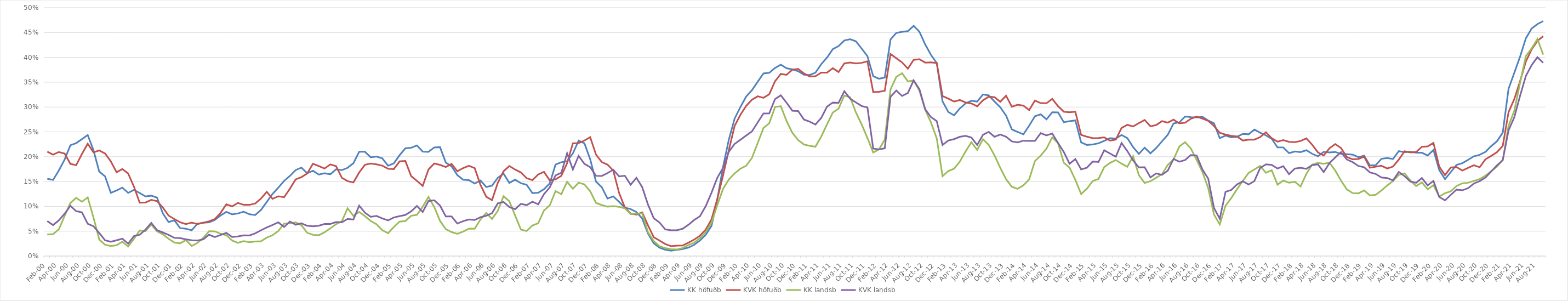
| Category | KK höfuðb | KVK höfuðb | KK landsb | KVK landsb |
|---|---|---|---|---|
| feb.00 | 0.156 | 0.21 | 0.043 | 0.07 |
| mar.00 | 0.153 | 0.204 | 0.044 | 0.062 |
| apr.00 | 0.172 | 0.209 | 0.054 | 0.072 |
| maí.00 | 0.194 | 0.206 | 0.081 | 0.085 |
| jún.00 | 0.223 | 0.186 | 0.107 | 0.101 |
| júl.00 | 0.227 | 0.183 | 0.117 | 0.09 |
| ágú.00 | 0.235 | 0.205 | 0.109 | 0.088 |
| sep.00 | 0.244 | 0.226 | 0.118 | 0.065 |
| okt.00 | 0.213 | 0.209 | 0.077 | 0.06 |
| nóv.00 | 0.17 | 0.213 | 0.033 | 0.046 |
| des.00 | 0.16 | 0.206 | 0.023 | 0.032 |
| jan.01 | 0.127 | 0.191 | 0.02 | 0.029 |
| feb.01 | 0.132 | 0.169 | 0.022 | 0.032 |
| mar.01 | 0.138 | 0.175 | 0.029 | 0.035 |
| apr.01 | 0.127 | 0.166 | 0.019 | 0.025 |
| maí.01 | 0.133 | 0.14 | 0.034 | 0.04 |
| jún.01 | 0.127 | 0.107 | 0.051 | 0.043 |
| júl.01 | 0.12 | 0.108 | 0.05 | 0.053 |
| ágú.01 | 0.122 | 0.113 | 0.063 | 0.067 |
| sep.01 | 0.118 | 0.111 | 0.05 | 0.052 |
| okt.01 | 0.086 | 0.098 | 0.044 | 0.047 |
| nóv.01 | 0.068 | 0.081 | 0.035 | 0.043 |
| des.01 | 0.072 | 0.074 | 0.027 | 0.037 |
| jan.02 | 0.056 | 0.068 | 0.026 | 0.036 |
| feb.02 | 0.055 | 0.064 | 0.032 | 0.034 |
| mar.02 | 0.052 | 0.067 | 0.02 | 0.032 |
| apr.02 | 0.065 | 0.064 | 0.026 | 0.031 |
| maí.02 | 0.067 | 0.067 | 0.037 | 0.034 |
| jún.02 | 0.068 | 0.07 | 0.05 | 0.043 |
| júl.02 | 0.073 | 0.074 | 0.05 | 0.038 |
| ágú.02 | 0.082 | 0.087 | 0.045 | 0.042 |
| sep.02 | 0.089 | 0.104 | 0.042 | 0.047 |
| okt.02 | 0.084 | 0.1 | 0.031 | 0.038 |
| nóv.02 | 0.086 | 0.107 | 0.027 | 0.039 |
| des.02 | 0.089 | 0.103 | 0.03 | 0.042 |
| jan.03 | 0.084 | 0.103 | 0.028 | 0.042 |
| feb.03 | 0.083 | 0.106 | 0.029 | 0.046 |
| mar.03 | 0.093 | 0.116 | 0.03 | 0.052 |
| apr.03 | 0.109 | 0.129 | 0.037 | 0.058 |
| maí.03 | 0.125 | 0.115 | 0.042 | 0.062 |
| jún.03 | 0.138 | 0.12 | 0.05 | 0.068 |
| júl.03 | 0.151 | 0.118 | 0.065 | 0.059 |
| ágú.03 | 0.161 | 0.135 | 0.066 | 0.069 |
| sep.03 | 0.173 | 0.154 | 0.068 | 0.063 |
| okt.03 | 0.178 | 0.159 | 0.062 | 0.066 |
| nóv.03 | 0.167 | 0.166 | 0.047 | 0.061 |
| des.03 | 0.172 | 0.186 | 0.043 | 0.06 |
| jan.04 | 0.164 | 0.181 | 0.042 | 0.061 |
| feb.04 | 0.167 | 0.176 | 0.048 | 0.064 |
| mar.04 | 0.165 | 0.185 | 0.056 | 0.065 |
| apr.04 | 0.175 | 0.181 | 0.064 | 0.068 |
| maí.04 | 0.173 | 0.158 | 0.07 | 0.068 |
| jún.04 | 0.178 | 0.151 | 0.096 | 0.075 |
| júl.04 | 0.187 | 0.148 | 0.081 | 0.074 |
| ágú.04 | 0.21 | 0.168 | 0.089 | 0.101 |
| sep.04 | 0.21 | 0.184 | 0.08 | 0.087 |
| okt.04 | 0.199 | 0.186 | 0.071 | 0.079 |
| nóv.04 | 0.2 | 0.185 | 0.064 | 0.081 |
| des.04 | 0.197 | 0.182 | 0.052 | 0.076 |
| jan.05 | 0.182 | 0.176 | 0.046 | 0.072 |
| feb.05 | 0.187 | 0.175 | 0.059 | 0.078 |
| mar.05 | 0.203 | 0.191 | 0.069 | 0.08 |
| apr.05 | 0.217 | 0.191 | 0.07 | 0.083 |
| maí.05 | 0.218 | 0.161 | 0.081 | 0.09 |
| jún.05 | 0.223 | 0.151 | 0.083 | 0.101 |
| júl.05 | 0.21 | 0.141 | 0.099 | 0.089 |
| ágú.05 | 0.21 | 0.174 | 0.119 | 0.111 |
| sep.05 | 0.219 | 0.186 | 0.099 | 0.112 |
| okt.05 | 0.219 | 0.184 | 0.071 | 0.102 |
| nóv.05 | 0.188 | 0.179 | 0.054 | 0.08 |
| des.05 | 0.181 | 0.185 | 0.048 | 0.08 |
| jan.06 | 0.163 | 0.171 | 0.045 | 0.065 |
| feb.06 | 0.154 | 0.177 | 0.049 | 0.07 |
| mar.06 | 0.153 | 0.182 | 0.055 | 0.074 |
| apr.06 | 0.146 | 0.177 | 0.055 | 0.072 |
| maí.06 | 0.152 | 0.143 | 0.074 | 0.078 |
| jún.06 | 0.139 | 0.119 | 0.087 | 0.081 |
| júl.06 | 0.142 | 0.113 | 0.075 | 0.086 |
| ágú.06 | 0.158 | 0.147 | 0.091 | 0.106 |
| sep.06 | 0.166 | 0.171 | 0.121 | 0.109 |
| okt.06 | 0.147 | 0.181 | 0.11 | 0.099 |
| nóv.06 | 0.154 | 0.174 | 0.082 | 0.094 |
| des.06 | 0.147 | 0.168 | 0.053 | 0.105 |
| jan.07 | 0.143 | 0.157 | 0.05 | 0.103 |
| feb.07 | 0.127 | 0.153 | 0.061 | 0.109 |
| mar.07 | 0.127 | 0.164 | 0.066 | 0.104 |
| apr.07 | 0.135 | 0.169 | 0.092 | 0.125 |
| maí.07 | 0.146 | 0.152 | 0.102 | 0.138 |
| jún.07 | 0.184 | 0.155 | 0.131 | 0.162 |
| júl.07 | 0.189 | 0.161 | 0.124 | 0.168 |
| ágú.07 | 0.191 | 0.187 | 0.15 | 0.207 |
| sep.07 | 0.207 | 0.227 | 0.136 | 0.174 |
| okt.07 | 0.232 | 0.227 | 0.148 | 0.202 |
| nóv.07 | 0.227 | 0.233 | 0.144 | 0.186 |
| des.07 | 0.195 | 0.239 | 0.13 | 0.179 |
| jan.08 | 0.15 | 0.204 | 0.107 | 0.162 |
| feb.08 | 0.139 | 0.189 | 0.103 | 0.161 |
| mar.08 | 0.116 | 0.184 | 0.099 | 0.167 |
| apr.08 | 0.12 | 0.172 | 0.101 | 0.174 |
| maí.08 | 0.109 | 0.127 | 0.099 | 0.16 |
| jún.08 | 0.098 | 0.098 | 0.096 | 0.162 |
| júl.08 | 0.094 | 0.085 | 0.084 | 0.144 |
| ágú.08 | 0.089 | 0.083 | 0.085 | 0.158 |
| sep.08 | 0.076 | 0.088 | 0.086 | 0.139 |
| okt.08 | 0.045 | 0.062 | 0.048 | 0.104 |
| nóv.08 | 0.026 | 0.038 | 0.03 | 0.076 |
| des.08 | 0.017 | 0.031 | 0.02 | 0.068 |
| jan.09 | 0.013 | 0.024 | 0.016 | 0.054 |
| feb.09 | 0.011 | 0.02 | 0.014 | 0.052 |
| mar.09 | 0.012 | 0.021 | 0.013 | 0.052 |
| apr.09 | 0.014 | 0.021 | 0.016 | 0.055 |
| maí.09 | 0.017 | 0.027 | 0.022 | 0.063 |
| jún.09 | 0.023 | 0.033 | 0.027 | 0.073 |
| júl.09 | 0.031 | 0.041 | 0.036 | 0.08 |
| ágú.09 | 0.043 | 0.053 | 0.048 | 0.1 |
| sep.09 | 0.061 | 0.074 | 0.067 | 0.127 |
| okt.09 | 0.114 | 0.115 | 0.102 | 0.157 |
| nóv.09 | 0.179 | 0.162 | 0.135 | 0.177 |
| des.09 | 0.234 | 0.213 | 0.154 | 0.21 |
| jan.10 | 0.277 | 0.262 | 0.166 | 0.226 |
| feb.10 | 0.3 | 0.284 | 0.176 | 0.234 |
| mar.10 | 0.321 | 0.302 | 0.182 | 0.243 |
| apr.10 | 0.334 | 0.315 | 0.198 | 0.251 |
| maí.10 | 0.351 | 0.322 | 0.227 | 0.269 |
| jún.10 | 0.368 | 0.319 | 0.258 | 0.287 |
| júl.10 | 0.369 | 0.326 | 0.267 | 0.287 |
| ágú.10 | 0.379 | 0.352 | 0.3 | 0.316 |
| sep.10 | 0.385 | 0.367 | 0.302 | 0.324 |
| okt.10 | 0.378 | 0.365 | 0.272 | 0.309 |
| nóv.10 | 0.376 | 0.375 | 0.248 | 0.293 |
| des.10 | 0.372 | 0.377 | 0.233 | 0.292 |
| jan.11 | 0.365 | 0.368 | 0.225 | 0.275 |
| feb.11 | 0.365 | 0.362 | 0.222 | 0.271 |
| mar.11 | 0.369 | 0.362 | 0.22 | 0.265 |
| apr.11 | 0.386 | 0.369 | 0.24 | 0.278 |
| maí.11 | 0.4 | 0.369 | 0.265 | 0.301 |
| jún.11 | 0.417 | 0.378 | 0.289 | 0.309 |
| júl.11 | 0.423 | 0.37 | 0.297 | 0.308 |
| ágú.11 | 0.434 | 0.388 | 0.323 | 0.332 |
| sep.11 | 0.436 | 0.39 | 0.32 | 0.317 |
| okt.11 | 0.432 | 0.388 | 0.289 | 0.309 |
| nóv.11 | 0.418 | 0.389 | 0.265 | 0.302 |
| des.11 | 0.402 | 0.392 | 0.238 | 0.299 |
| jan.12 | 0.362 | 0.33 | 0.209 | 0.216 |
| feb.12 | 0.357 | 0.331 | 0.215 | 0.215 |
| mar.12 | 0.359 | 0.333 | 0.234 | 0.217 |
| apr.12 | 0.436 | 0.407 | 0.336 | 0.321 |
| maí.12 | 0.449 | 0.398 | 0.361 | 0.333 |
| jún.12 | 0.451 | 0.39 | 0.368 | 0.322 |
| júl.12 | 0.453 | 0.377 | 0.352 | 0.328 |
| ágú.12 | 0.463 | 0.395 | 0.354 | 0.354 |
| sep.12 | 0.452 | 0.396 | 0.333 | 0.336 |
| okt.12 | 0.426 | 0.389 | 0.294 | 0.295 |
| nóv.12 | 0.405 | 0.39 | 0.269 | 0.28 |
| des.12 | 0.388 | 0.389 | 0.237 | 0.272 |
| jan.13 | 0.312 | 0.322 | 0.161 | 0.224 |
| feb.13 | 0.29 | 0.317 | 0.171 | 0.233 |
| mar.13 | 0.283 | 0.311 | 0.176 | 0.235 |
| apr.13 | 0.297 | 0.314 | 0.19 | 0.24 |
| maí.13 | 0.307 | 0.309 | 0.211 | 0.242 |
| jún.13 | 0.313 | 0.307 | 0.229 | 0.239 |
| júl.13 | 0.311 | 0.301 | 0.214 | 0.224 |
| ágú.13 | 0.325 | 0.314 | 0.235 | 0.244 |
| sep.13 | 0.323 | 0.321 | 0.224 | 0.25 |
| okt.13 | 0.311 | 0.32 | 0.203 | 0.24 |
| nóv.13 | 0.3 | 0.311 | 0.178 | 0.245 |
| des.13 | 0.283 | 0.323 | 0.155 | 0.24 |
| jan.14 | 0.255 | 0.301 | 0.139 | 0.231 |
| feb.14 | 0.25 | 0.305 | 0.135 | 0.229 |
| mar.14 | 0.245 | 0.303 | 0.142 | 0.232 |
| apr.14 | 0.262 | 0.294 | 0.154 | 0.232 |
| maí.14 | 0.281 | 0.313 | 0.191 | 0.232 |
| jún.14 | 0.285 | 0.308 | 0.202 | 0.248 |
| júl.14 | 0.275 | 0.308 | 0.216 | 0.243 |
| ágú.14 | 0.289 | 0.316 | 0.239 | 0.247 |
| sep.14 | 0.289 | 0.302 | 0.227 | 0.228 |
| okt.14 | 0.269 | 0.291 | 0.188 | 0.209 |
| nóv.14 | 0.272 | 0.289 | 0.178 | 0.186 |
| des.14 | 0.273 | 0.29 | 0.153 | 0.195 |
| jan.15 | 0.229 | 0.244 | 0.125 | 0.174 |
| feb.15 | 0.224 | 0.24 | 0.136 | 0.178 |
| mar.15 | 0.225 | 0.237 | 0.151 | 0.19 |
| apr.15 | 0.227 | 0.238 | 0.155 | 0.189 |
| maí.15 | 0.232 | 0.239 | 0.179 | 0.213 |
| jún.15 | 0.237 | 0.232 | 0.188 | 0.206 |
| júl.15 | 0.236 | 0.234 | 0.193 | 0.2 |
| ágú.15 | 0.244 | 0.258 | 0.186 | 0.228 |
| sep.15 | 0.238 | 0.264 | 0.18 | 0.211 |
| okt.15 | 0.219 | 0.261 | 0.201 | 0.192 |
| nóv.15 | 0.206 | 0.268 | 0.163 | 0.178 |
| des.15 | 0.218 | 0.274 | 0.147 | 0.179 |
| jan.16 | 0.207 | 0.261 | 0.151 | 0.158 |
| feb.16 | 0.218 | 0.264 | 0.158 | 0.166 |
| mar.16 | 0.231 | 0.272 | 0.165 | 0.163 |
| apr.16 | 0.244 | 0.269 | 0.183 | 0.172 |
| maí.16 | 0.267 | 0.275 | 0.194 | 0.195 |
| jún.16 | 0.269 | 0.267 | 0.22 | 0.19 |
| júl.16 | 0.281 | 0.268 | 0.229 | 0.193 |
| ágú.16 | 0.28 | 0.276 | 0.217 | 0.203 |
| sep.16 | 0.279 | 0.281 | 0.193 | 0.202 |
| okt.16 | 0.28 | 0.277 | 0.169 | 0.174 |
| nóv.16 | 0.273 | 0.272 | 0.137 | 0.156 |
| des.16 | 0.267 | 0.262 | 0.084 | 0.097 |
| jan.17 | 0.237 | 0.248 | 0.064 | 0.075 |
| feb.17 | 0.243 | 0.244 | 0.101 | 0.129 |
| mar.17 | 0.239 | 0.242 | 0.117 | 0.133 |
| apr.17 | 0.24 | 0.241 | 0.135 | 0.144 |
| maí.17 | 0.246 | 0.233 | 0.151 | 0.151 |
| jún.17 | 0.245 | 0.234 | 0.167 | 0.144 |
| júl.17 | 0.255 | 0.234 | 0.174 | 0.151 |
| ágú.17 | 0.248 | 0.239 | 0.181 | 0.177 |
| sep.17 | 0.243 | 0.249 | 0.168 | 0.184 |
| okt.17 | 0.236 | 0.237 | 0.173 | 0.183 |
| nóv.17 | 0.219 | 0.23 | 0.144 | 0.176 |
| des.17 | 0.219 | 0.233 | 0.152 | 0.181 |
| jan.18 | 0.207 | 0.23 | 0.148 | 0.165 |
| feb.18 | 0.21 | 0.229 | 0.149 | 0.176 |
| mar.18 | 0.209 | 0.232 | 0.14 | 0.178 |
| apr.18 | 0.213 | 0.237 | 0.166 | 0.176 |
| maí.18 | 0.206 | 0.224 | 0.184 | 0.183 |
| jún.18 | 0.201 | 0.209 | 0.188 | 0.185 |
| júl.18 | 0.21 | 0.202 | 0.186 | 0.169 |
| ágú.18 | 0.209 | 0.217 | 0.188 | 0.187 |
| sep.18 | 0.21 | 0.225 | 0.172 | 0.199 |
| okt.18 | 0.206 | 0.217 | 0.152 | 0.209 |
| nóv.18 | 0.205 | 0.199 | 0.134 | 0.194 |
| des.18 | 0.204 | 0.195 | 0.127 | 0.189 |
| jan.19 | 0.199 | 0.195 | 0.126 | 0.181 |
| feb.19 | 0.202 | 0.2 | 0.132 | 0.179 |
| mar.19 | 0.182 | 0.178 | 0.122 | 0.168 |
| apr.19 | 0.183 | 0.18 | 0.123 | 0.165 |
| maí.19 | 0.196 | 0.182 | 0.132 | 0.158 |
| jún.19 | 0.197 | 0.176 | 0.142 | 0.157 |
| júl.19 | 0.195 | 0.18 | 0.151 | 0.152 |
| ágú.19 | 0.211 | 0.194 | 0.163 | 0.169 |
| sep.19 | 0.209 | 0.211 | 0.167 | 0.161 |
| okt.19 | 0.21 | 0.209 | 0.152 | 0.15 |
| nóv.19 | 0.208 | 0.209 | 0.141 | 0.147 |
| des.19 | 0.208 | 0.22 | 0.148 | 0.157 |
| jan.20 | 0.202 | 0.221 | 0.134 | 0.142 |
| feb.20 | 0.213 | 0.228 | 0.143 | 0.151 |
| mars.20* | 0.173 | 0.18 | 0.12 | 0.119 |
| apr.20 | 0.155 | 0.163 | 0.126 | 0.112 |
| maí.20 | 0.169 | 0.178 | 0.13 | 0.123 |
| jún.20 | 0.183 | 0.179 | 0.141 | 0.134 |
| júl.20 | 0.187 | 0.172 | 0.146 | 0.132 |
| ágú.20 | 0.194 | 0.178 | 0.147 | 0.137 |
| sep.20 | 0.201 | 0.183 | 0.151 | 0.146 |
| okt.20 | 0.204 | 0.179 | 0.155 | 0.151 |
| nóv.20 | 0.21 | 0.195 | 0.162 | 0.158 |
| des.20 | 0.221 | 0.202 | 0.171 | 0.17 |
| jan.21 | 0.231 | 0.209 | 0.18 | 0.183 |
| feb.21 | 0.248 | 0.222 | 0.193 | 0.193 |
| mar.21 | 0.337 | 0.29 | 0.262 | 0.253 |
| apr.21 | 0.369 | 0.316 | 0.292 | 0.279 |
| maí.21 | 0.402 | 0.352 | 0.349 | 0.323 |
| jún.21 | 0.438 | 0.392 | 0.403 | 0.362 |
| júl.21 | 0.458 | 0.416 | 0.418 | 0.384 |
| ágú.21 | 0.467 | 0.433 | 0.437 | 0.4 |
| sep.21 | 0.473 | 0.443 | 0.406 | 0.389 |